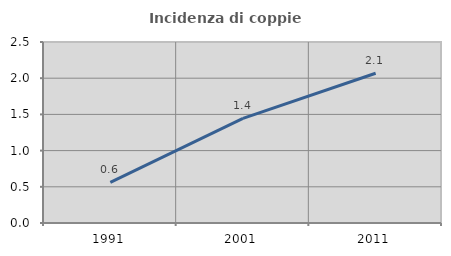
| Category | Incidenza di coppie miste |
|---|---|
| 1991.0 | 0.56 |
| 2001.0 | 1.445 |
| 2011.0 | 2.068 |